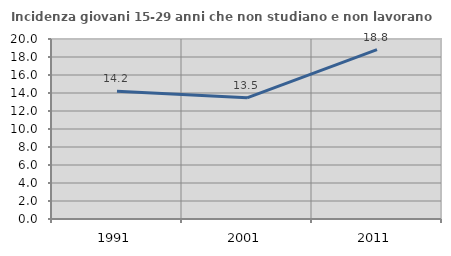
| Category | Incidenza giovani 15-29 anni che non studiano e non lavorano  |
|---|---|
| 1991.0 | 14.196 |
| 2001.0 | 13.461 |
| 2011.0 | 18.81 |